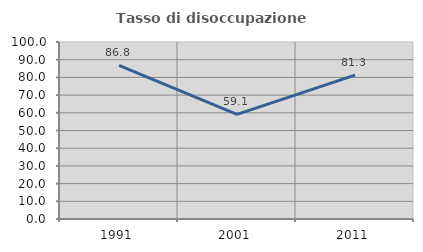
| Category | Tasso di disoccupazione giovanile  |
|---|---|
| 1991.0 | 86.842 |
| 2001.0 | 59.091 |
| 2011.0 | 81.25 |